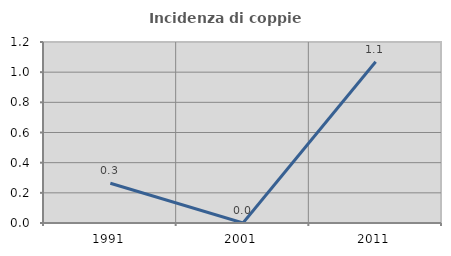
| Category | Incidenza di coppie miste |
|---|---|
| 1991.0 | 0.264 |
| 2001.0 | 0 |
| 2011.0 | 1.07 |